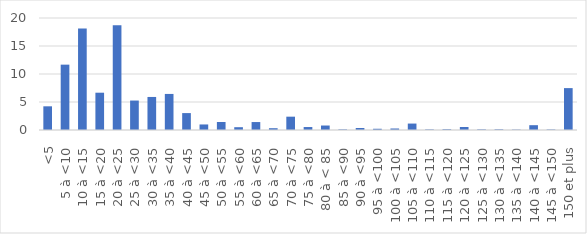
| Category | Series 0 |
|---|---|
| <5 | 4.23 |
| 5 à <10 | 11.67 |
| 10 à <15 | 18.11 |
| 15 à <20 | 6.66 |
| 20 à <25 | 18.72 |
| 25 à <30 | 5.26 |
| 30 à <35 | 5.9 |
| 35 à <40 | 6.44 |
| 40 à <45 | 3.02 |
| 45 à <50 | 0.99 |
| 50 à <55 | 1.43 |
| 55 à <60 | 0.5 |
| 60 à <65 | 1.42 |
| 65 à <70 | 0.32 |
| 70 à <75 | 2.38 |
| 75 à <80 | 0.53 |
| 80 à < 85 | 0.8 |
| 85 à <90 | 0.11 |
| 90 à <95 | 0.36 |
| 95 à <100 | 0.22 |
| 100 à <105 | 0.27 |
| 105 à <110 | 1.15 |
| 110 à <115 | 0.1 |
| 115 à <120 | 0.14 |
| 120 à <125 | 0.54 |
| 125 à <130 | 0.11 |
| 130 à <135 | 0.12 |
| 135 à <140 | 0.07 |
| 140 à <145 | 0.86 |
| 145 à <150 | 0.09 |
| 150 et plus | 7.48 |